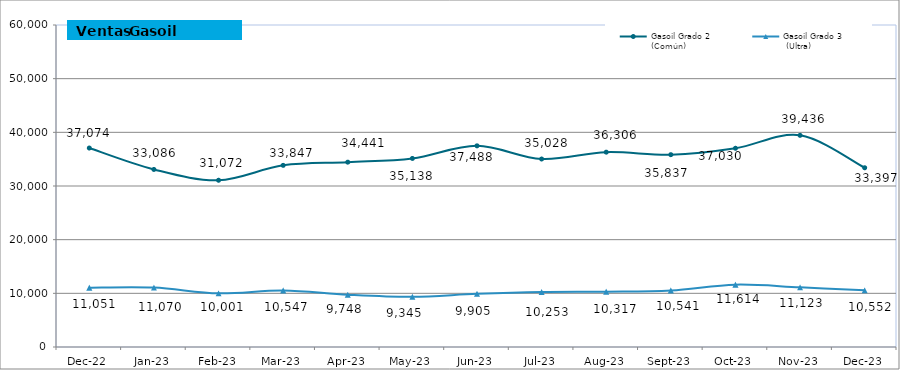
| Category | Gasoil Grado 2
(Común) | Gasoil Grado 3
 (Ultra)  |
|---|---|---|
| 2022-12-01 | 37074.47 | 11051.35 |
| 2023-01-01 | 33085.705 | 11069.894 |
| 2023-02-01 | 31071.883 | 10000.546 |
| 2023-03-01 | 33846.5 | 10547 |
| 2023-04-01 | 34440.83 | 9748.48 |
| 2023-05-01 | 35137.68 | 9345.26 |
| 2023-06-01 | 37488.31 | 9904.61 |
| 2023-07-01 | 35028.11 | 10252.91 |
| 2023-08-01 | 36305.95 | 10317.13 |
| 2023-09-01 | 35836.72 | 10540.82 |
| 2023-10-01 | 37030.076 | 11613.917 |
| 2023-11-01 | 39436.095 | 11122.546 |
| 2023-12-01 | 33396.735 | 10552.25 |